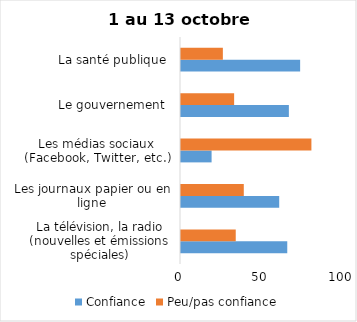
| Category | Confiance | Peu/pas confiance |
|---|---|---|
| La télévision, la radio (nouvelles et émissions spéciales) | 66 | 34 |
| Les journaux papier ou en ligne | 61 | 39 |
| Les médias sociaux (Facebook, Twitter, etc.) | 19 | 81 |
| Le gouvernement  | 67 | 33 |
| La santé publique  | 74 | 26 |